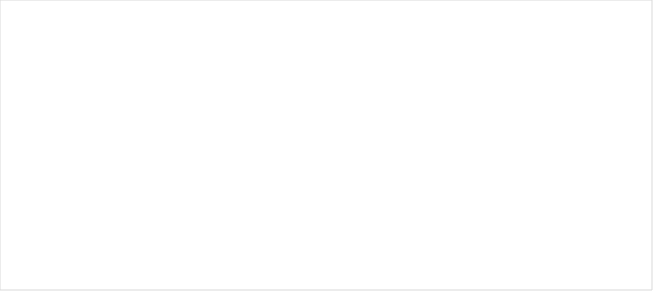
| Category | RESERVAS CONSTITUIDAS
 | CANCELACIONES RESERVAS PRESUPUESTALES
  | PAGOS
ACUMULADOS
 |
|---|---|---|---|
| A-FUNCIONAMIENTO | 2249.649 | 0 | 2203.835 |
| C-INVERSIÓN | 53197.266 | 0 | 36722.061 |